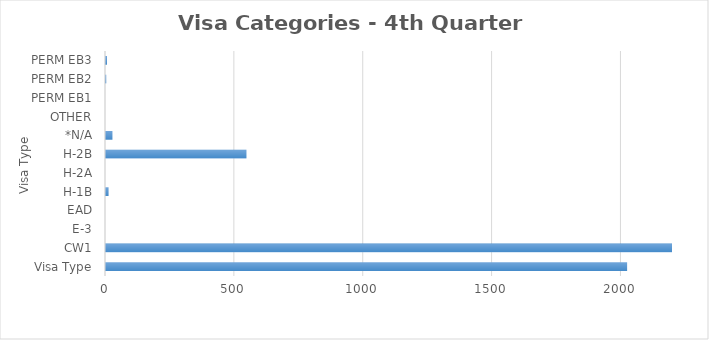
| Category | Series 0 |
|---|---|
| Visa Type | 2022 |
| CW1 | 2810 |
| E-3 | 0 |
| EAD | 0 |
| H-1B | 10 |
| H-2A | 0 |
| H-2B | 545 |
| *N/A | 25 |
| OTHER | 0 |
| PERM EB1 | 0 |
| PERM EB2 | 1 |
| PERM EB3 | 4 |